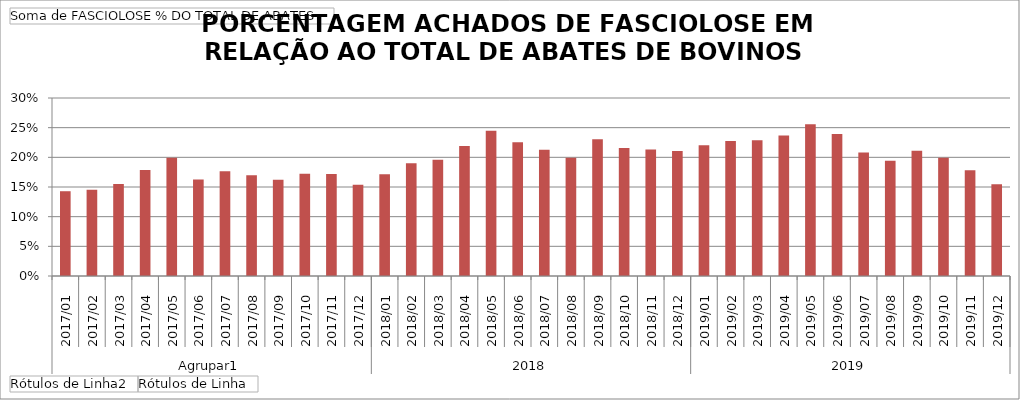
| Category | Total |
|---|---|
| 0 | 0.143 |
| 1 | 0.145 |
| 2 | 0.155 |
| 3 | 0.179 |
| 4 | 0.199 |
| 5 | 0.163 |
| 6 | 0.176 |
| 7 | 0.17 |
| 8 | 0.162 |
| 9 | 0.172 |
| 10 | 0.172 |
| 11 | 0.154 |
| 12 | 0.172 |
| 13 | 0.19 |
| 14 | 0.196 |
| 15 | 0.219 |
| 16 | 0.245 |
| 17 | 0.225 |
| 18 | 0.213 |
| 19 | 0.199 |
| 20 | 0.23 |
| 21 | 0.216 |
| 22 | 0.213 |
| 23 | 0.211 |
| 24 | 0.22 |
| 25 | 0.228 |
| 26 | 0.229 |
| 27 | 0.237 |
| 28 | 0.256 |
| 29 | 0.239 |
| 30 | 0.208 |
| 31 | 0.194 |
| 32 | 0.211 |
| 33 | 0.199 |
| 34 | 0.178 |
| 35 | 0.155 |